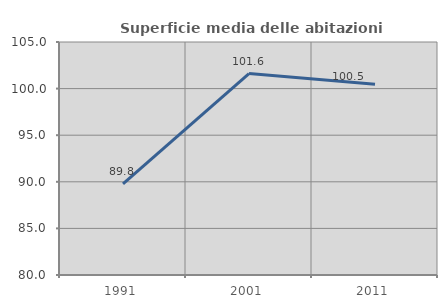
| Category | Superficie media delle abitazioni occupate |
|---|---|
| 1991.0 | 89.767 |
| 2001.0 | 101.608 |
| 2011.0 | 100.459 |